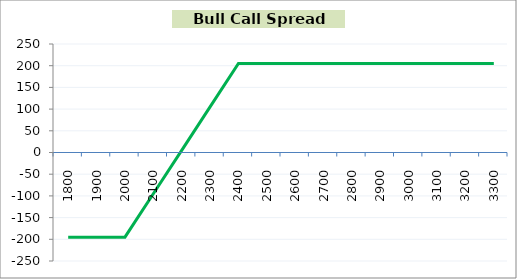
| Category | Series 1 |
|---|---|
| 1800.0 | -195 |
| 1900.0 | -195 |
| 2000.0 | -195 |
| 2100.0 | -95 |
| 2200.0 | 5 |
| 2300.0 | 105 |
| 2400.0 | 205 |
| 2500.0 | 205 |
| 2600.0 | 205 |
| 2700.0 | 205 |
| 2800.0 | 205 |
| 2900.0 | 205 |
| 3000.0 | 205 |
| 3100.0 | 205 |
| 3200.0 | 205 |
| 3300.0 | 205 |